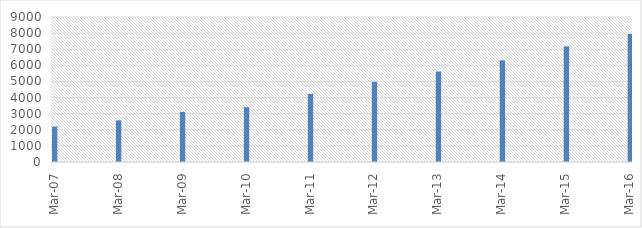
| Category | Sales |
|---|---|
| 2007-03-31 | 2199.29 |
| 2008-03-31 | 2584.1 |
| 2009-03-31 | 3112.21 |
| 2010-03-31 | 3403.46 |
| 2011-03-31 | 4223.52 |
| 2012-03-31 | 4974.19 |
| 2013-03-31 | 5615.49 |
| 2014-03-31 | 6307.39 |
| 2015-03-31 | 7175.99 |
| 2016-03-31 | 7947.9 |